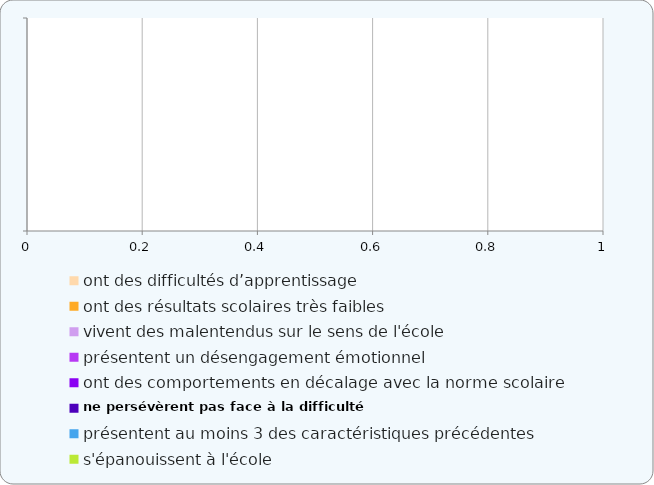
| Category | ont des difficultés d’apprentissage | ont des résultats scolaires très faibles | vivent des malentendus sur le sens de l'école  | présentent un désengagement émotionnel  | ont des comportements en décalage avec la norme scolaire  | ne persévèrent pas face à la difficulté | présentent au moins 3 des caractéristiques précédentes | s'épanouissent à l'école |
|---|---|---|---|---|---|---|---|---|
|  | 0 | 0 | 0 | 0 | 0 | 0 | 0 | 0 |